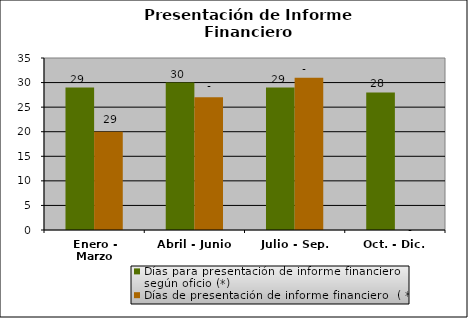
| Category | Días para presentación de informe financiero según oficio (*) | Días de presentación de informe financiero  ( ** ) |
|---|---|---|
| Enero - Marzo | 29 | 20 |
| Abril - Junio | 30 | 27 |
| Julio - Sep. | 29 | 31 |
| Oct. - Dic. | 28 | 0 |